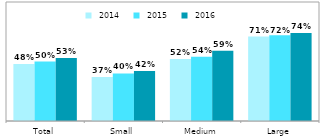
| Category |  2014 |  2015 |  2016 |
|---|---|---|---|
| Total | 0.48 | 0.5 | 0.53 |
| Small | 0.37 | 0.4 | 0.42 |
| Medium | 0.52 | 0.54 | 0.59 |
| Large | 0.71 | 0.72 | 0.74 |